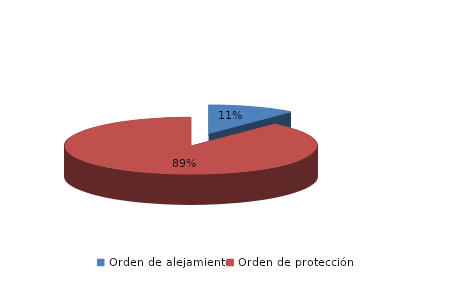
| Category | Series 0 |
|---|---|
| Orden de alejamiento | 30 |
| Orden de protección | 237 |